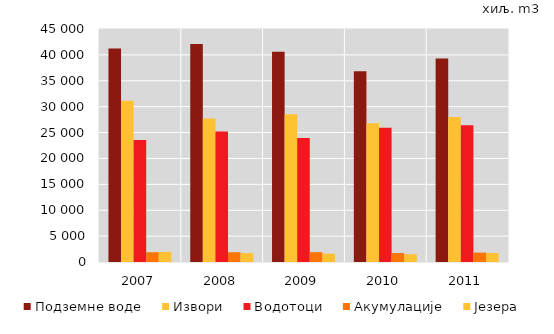
| Category | Подземне воде | Извори | Водотоци | Акумулације | Језера |
|---|---|---|---|---|---|
| 2007.0 | 41235 | 31121 | 23558 | 1883 | 1942 |
| 2008.0 | 42116 | 27707 | 25217 | 1886 | 1716 |
| 2009.0 | 40602 | 28554 | 23931 | 1898 | 1605 |
| 2010.0 | 36855 | 26799 | 25945 | 1729 | 1500 |
| 2011.0 | 39304 | 27998 | 26393 | 1816 | 1746 |